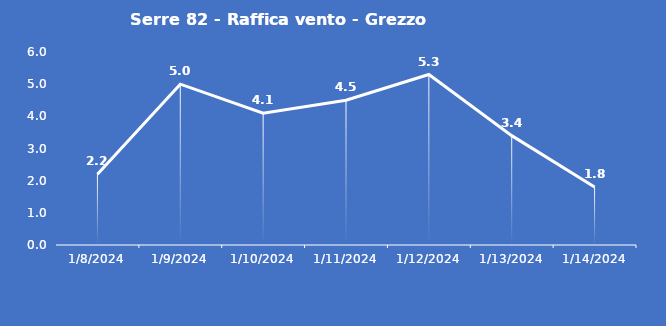
| Category | Serre 82 - Raffica vento - Grezzo (m/s) |
|---|---|
| 1/8/24 | 2.2 |
| 1/9/24 | 5 |
| 1/10/24 | 4.1 |
| 1/11/24 | 4.5 |
| 1/12/24 | 5.3 |
| 1/13/24 | 3.4 |
| 1/14/24 | 1.8 |